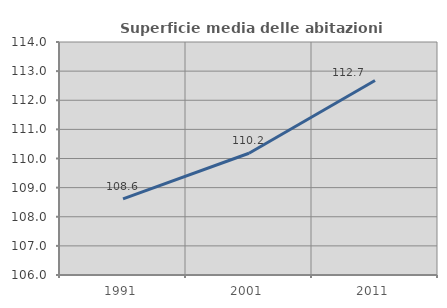
| Category | Superficie media delle abitazioni occupate |
|---|---|
| 1991.0 | 108.611 |
| 2001.0 | 110.18 |
| 2011.0 | 112.678 |